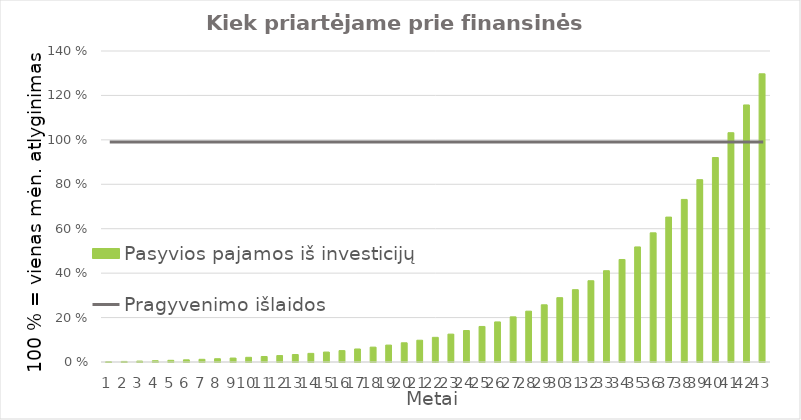
| Category | Pasyvios pajamos iš investicijų |
|---|---|
| 0 | 0.12 |
| 1 | 0.254 |
| 2 | 0.405 |
| 3 | 0.574 |
| 4 | 0.762 |
| 5 | 0.974 |
| 6 | 1.211 |
| 7 | 1.476 |
| 8 | 1.773 |
| 9 | 2.106 |
| 10 | 2.479 |
| 11 | 2.896 |
| 12 | 3.363 |
| 13 | 3.887 |
| 14 | 4.474 |
| 15 | 5.13 |
| 16 | 5.866 |
| 17 | 6.69 |
| 18 | 7.613 |
| 19 | 8.646 |
| 20 | 9.804 |
| 21 | 11.1 |
| 22 | 12.552 |
| 23 | 14.179 |
| 24 | 16 |
| 25 | 18.04 |
| 26 | 20.325 |
| 27 | 22.884 |
| 28 | 25.75 |
| 29 | 28.96 |
| 30 | 32.555 |
| 31 | 36.582 |
| 32 | 41.092 |
| 33 | 46.143 |
| 34 | 51.8 |
| 35 | 58.136 |
| 36 | 65.232 |
| 37 | 73.18 |
| 38 | 82.081 |
| 39 | 92.051 |
| 40 | 103.217 |
| 41 | 115.723 |
| 42 | 129.73 |